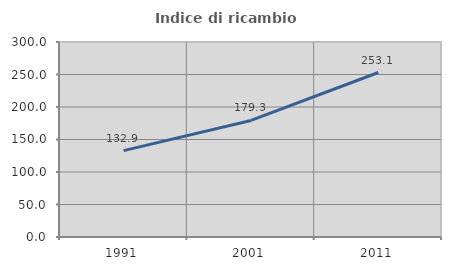
| Category | Indice di ricambio occupazionale  |
|---|---|
| 1991.0 | 132.857 |
| 2001.0 | 179.295 |
| 2011.0 | 253.061 |